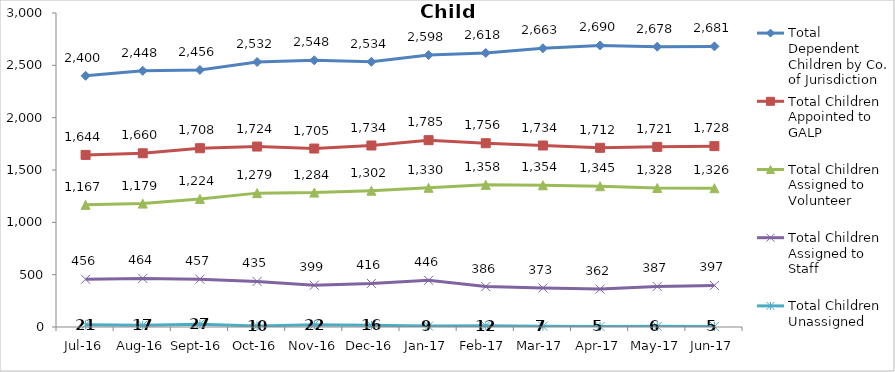
| Category | Total Dependent Children by Co. of Jurisdiction | Total Children Appointed to GALP | Total Children Assigned to Volunteer | Total Children Assigned to Staff | Total Children Unassigned |
|---|---|---|---|---|---|
| Jul-16 | 2400 | 1644 | 1167 | 456 | 21 |
| Aug-16 | 2448 | 1660 | 1179 | 464 | 17 |
| Sep-16 | 2456 | 1708 | 1224 | 457 | 27 |
| Oct-16 | 2532 | 1724 | 1279 | 435 | 10 |
| Nov-16 | 2548 | 1705 | 1284 | 399 | 22 |
| Dec-16 | 2534 | 1734 | 1302 | 416 | 16 |
| Jan-17 | 2598 | 1785 | 1330 | 446 | 9 |
| Feb-17 | 2618 | 1756 | 1358 | 386 | 12 |
| Mar-17 | 2663 | 1734 | 1354 | 373 | 7 |
| Apr-17 | 2690 | 1712 | 1345 | 362 | 5 |
| May-17 | 2678 | 1721 | 1328 | 387 | 6 |
| Jun-17 | 2681 | 1728 | 1326 | 397 | 5 |